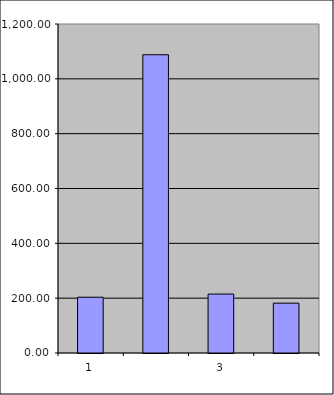
| Category | Series 0 |
|---|---|
| 0 | 203.5 |
| 1 | 1087.865 |
| 2 | 214.997 |
| 3 | 181.78 |